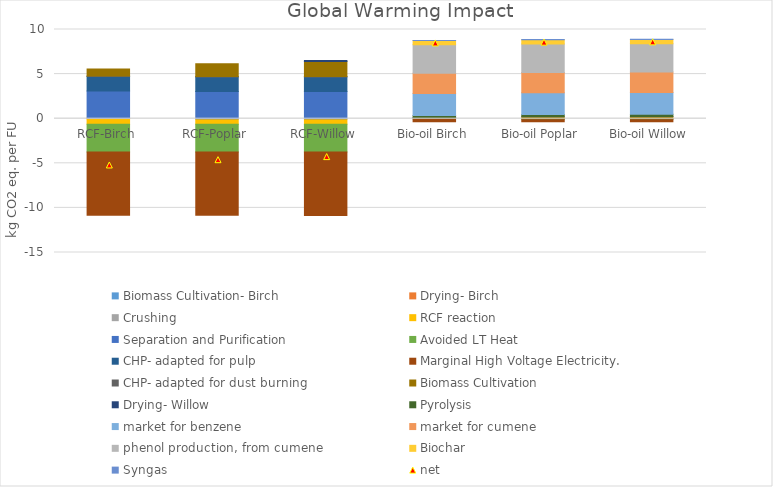
| Category | Biomass Cultivation- Birch | Drying- Birch | Crushing | RCF reaction | Separation and Purification | Avoided LT Heat  | CHP- adapted for pulp | Marginal High Voltage Electricity.  | CHP- adapted for dust burning | Biomass Cultivation | Drying- Willow | Pyrolysis | market for benzene | market for cumene | phenol production, from cumene | Biochar | Syngas |
|---|---|---|---|---|---|---|---|---|---|---|---|---|---|---|---|---|---|
| RCF-Birch | 0 | 0.053 | 0 | -0.627 | 3.041 | -3.101 | 1.643 | -7.102 | 0.041 | 0.807 | 0 | 0 | 0 | 0 | 0 | 0 | 0 |
| RCF-Poplar | 0 | 0 | 0 | -0.627 | 3.041 | -3.099 | 1.642 | -7.096 | 0.04 | 1.447 | 0 | 0 | 0 | 0 | 0 | 0 | 0 |
| RCF-Willow | 0 | 0 | 0 | -0.627 | 3.041 | -3.103 | 1.644 | -7.113 | 0.045 | 1.688 | 0.119 | 0 | 0 | 0 | 0 | 0 | 0 |
| Bio-oil Birch | 0.115 | 0 | 0 | 0 | 0 | -0.007 | 0 | -0.334 | 0.002 | 0 | 0 | 0.254 | 2.445 | 2.286 | 3.177 | 0.476 | 0.024 |
| Bio-oil Poplar | 0 | 0 | 0 | 0 | 0 | -0.007 | 0 | -0.334 | 0.002 | 0.206 | 0 | 0.254 | 2.445 | 2.286 | 3.177 | 0.476 | 0.024 |
| Bio-oil Willow | 0 | 0 | 0 | 0 | 0 | -0.007 | 0 | -0.334 | 0.002 | 0.239 | 0 | 0.254 | 2.445 | 2.286 | 3.177 | 0.476 | 0.024 |